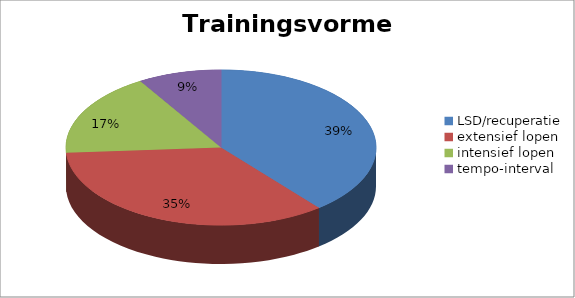
| Category | Series 0 |
|---|---|
| LSD/recuperatie | 135 |
| extensief lopen | 120 |
| intensief lopen | 60 |
| tempo-interval | 30 |